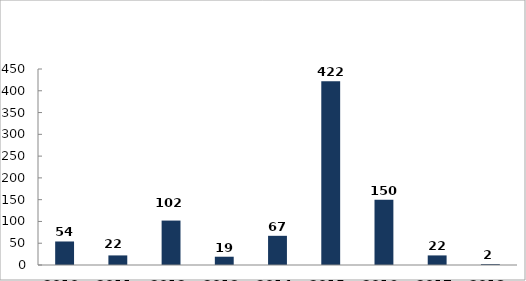
| Category | Illegális migrációhoz kapcsolódó jogellenes cselekmények száma |
|---|---|
| 2010. év | 54 |
| 2011. év | 22 |
| 2012. év | 102 |
| 2013. év | 19 |
| 2014. év | 67 |
| 2015. év | 422 |
| 2016. év | 150 |
| 2017. év | 22 |
| 2018. év | 2 |